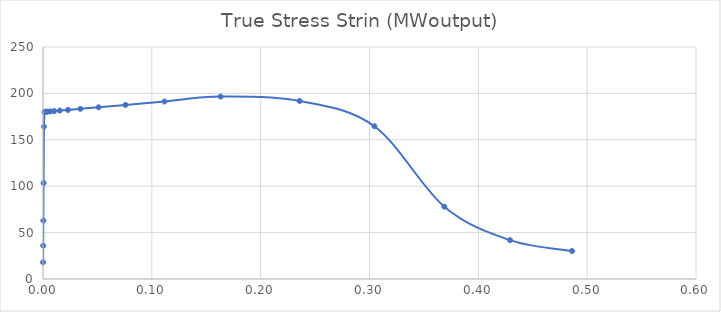
| Category | Series 0 |
|---|---|
| 8.99959502429071e-05 | 17.998 |
| 0.000179983801943807 | 35.996 |
| 0.000314950397916229 | 62.988 |
| 0.000517366143053604 | 103.471 |
| 0.000820912958736214 | 164.18 |
| 0.00127606548202025 | 180.031 |
| 0.00195839109970242 | 180.099 |
| 0.00298102233448872 | 180.202 |
| 0.00451300107383731 | 180.356 |
| 0.00680658256963524 | 180.587 |
| 0.0102371214079935 | 180.932 |
| 0.0153610132102306 | 181.448 |
| 0.0229978113721286 | 182.218 |
| 0.0343449033807882 | 183.365 |
| 0.0511277156801529 | 185.065 |
| 0.0757852575808854 | 187.572 |
| 0.111667484848671 | 191.24 |
| 0.163187156184584 | 196.543 |
| 0.235807819867008 | 191.835 |
| 0.304488303267768 | 164.6 |
| 0.368753404755717 | 77.946 |
| 0.429136711841463 | 41.841 |
| 0.486080574800857 | 30.135 |